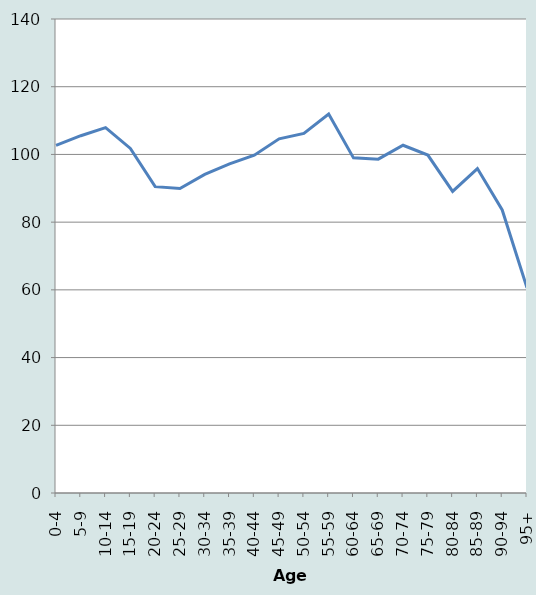
| Category | Homme |
|---|---|
| 0-4 | 102.702 |
| 5-9 | 105.525 |
| 10-14 | 107.91 |
| 15-19 | 101.784 |
| 20-24 | 90.478 |
| 25-29 | 89.933 |
| 30-34 | 94.104 |
| 35-39 | 97.215 |
| 40-44 | 99.786 |
| 45-49 | 104.602 |
| 50-54 | 106.202 |
| 55-59 | 111.927 |
| 60-64 | 98.983 |
| 65-69 | 98.613 |
| 70-74 | 102.711 |
| 75-79 | 99.805 |
| 80-84 | 89.072 |
| 85-89 | 95.817 |
| 90-94 | 83.607 |
| 95+ | 60.598 |